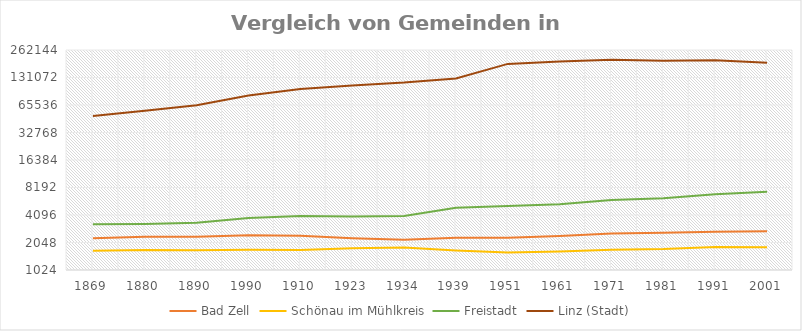
| Category | Bad Zell | Schönau im Mühlkreis | Freistadt | Linz (Stadt) |
|---|---|---|---|---|
| 1869.0 | 2277 | 1667 | 3253 | 49635 |
| 1880.0 | 2371 | 1700 | 3271 | 56569 |
| 1890.0 | 2366 | 1683 | 3361 | 65090 |
| 1990.0 | 2456 | 1703 | 3800 | 83356 |
| 1910.0 | 2431 | 1700 | 3988 | 97852 |
| 1923.0 | 2280 | 1770 | 3954 | 107463 |
| 1934.0 | 2199 | 1800 | 3992 | 115338 |
| 1939.0 | 2305 | 1677 | 4903 | 128177 |
| 1951.0 | 2305 | 1589 | 5136 | 184685 |
| 1961.0 | 2417 | 1629 | 5375 | 195978 |
| 1971.0 | 2571 | 1708 | 5963 | 204889 |
| 1981.0 | 2623 | 1736 | 6251 | 199910 |
| 1991.0 | 2687 | 1823 | 6917 | 203044 |
| 2001.0 | 2716 | 1818 | 7353 | 189889 |